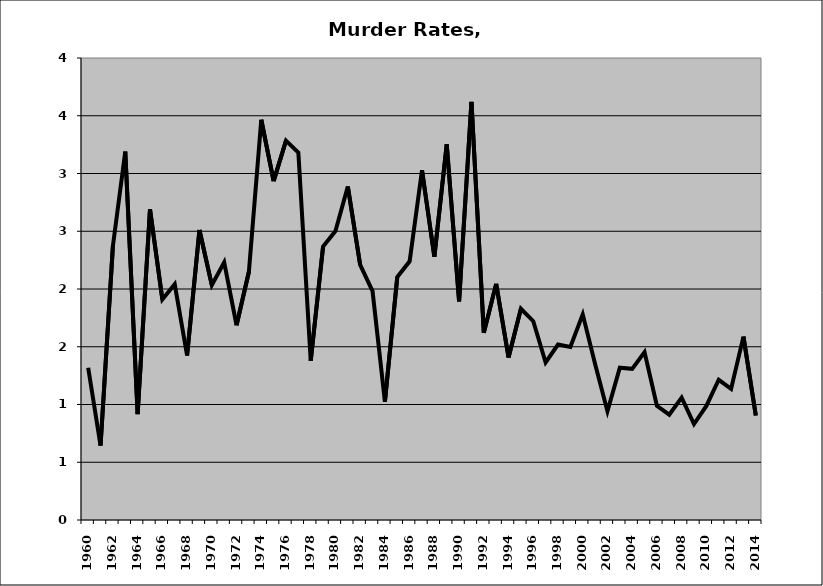
| Category | Murder |
|---|---|
| 1960.0 | 1.318 |
| 1961.0 | 0.644 |
| 1962.0 | 2.373 |
| 1963.0 | 3.19 |
| 1964.0 | 0.917 |
| 1965.0 | 2.691 |
| 1966.0 | 1.909 |
| 1967.0 | 2.041 |
| 1968.0 | 1.425 |
| 1969.0 | 2.51 |
| 1970.0 | 2.033 |
| 1971.0 | 2.231 |
| 1972.0 | 1.686 |
| 1973.0 | 2.149 |
| 1974.0 | 3.465 |
| 1975.0 | 2.934 |
| 1976.0 | 3.285 |
| 1977.0 | 3.18 |
| 1978.0 | 1.378 |
| 1979.0 | 2.368 |
| 1980.0 | 2.502 |
| 1981.0 | 2.888 |
| 1982.0 | 2.208 |
| 1983.0 | 1.981 |
| 1984.0 | 1.024 |
| 1985.0 | 2.104 |
| 1986.0 | 2.24 |
| 1987.0 | 3.027 |
| 1988.0 | 2.279 |
| 1989.0 | 3.252 |
| 1990.0 | 1.893 |
| 1991.0 | 3.62 |
| 1992.0 | 1.62 |
| 1993.0 | 2.044 |
| 1994.0 | 1.407 |
| 1995.0 | 1.829 |
| 1996.0 | 1.721 |
| 1997.0 | 1.364 |
| 1998.0 | 1.519 |
| 1999.0 | 1.499 |
| 2000.0 | 1.78 |
| 2001.0 | 1.35 |
| 2002.0 | 0.942 |
| 2003.0 | 1.319 |
| 2004.0 | 1.309 |
| 2005.0 | 1.454 |
| 2006.0 | 0.989 |
| 2007.0 | 0.912 |
| 2008.0 | 1.059 |
| 2009.0 | 0.83 |
| 2010.0 | 0.987 |
| 2011.0 | 1.214 |
| 2012.0 | 1.135 |
| 2013.0 | 1.588 |
| 2014.0 | 0.904 |